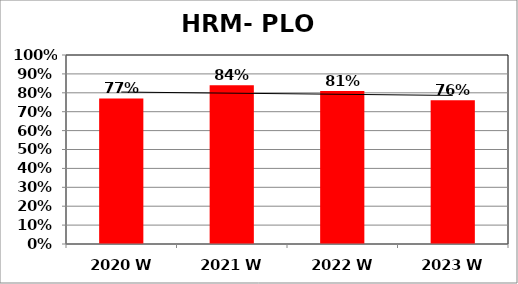
| Category | Series 0 |
|---|---|
| 2020 W | 0.77 |
| 2021 W | 0.84 |
| 2022 W | 0.81 |
| 2023 W | 0.76 |